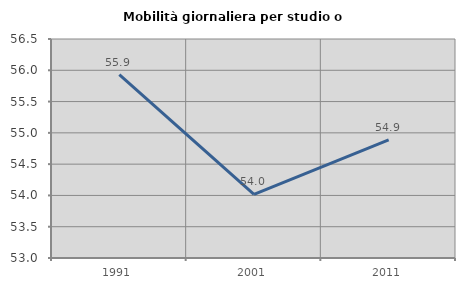
| Category | Mobilità giornaliera per studio o lavoro |
|---|---|
| 1991.0 | 55.932 |
| 2001.0 | 54.017 |
| 2011.0 | 54.887 |